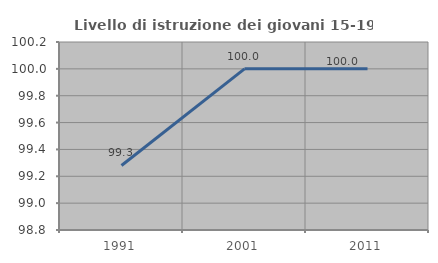
| Category | Livello di istruzione dei giovani 15-19 anni |
|---|---|
| 1991.0 | 99.281 |
| 2001.0 | 100 |
| 2011.0 | 100 |